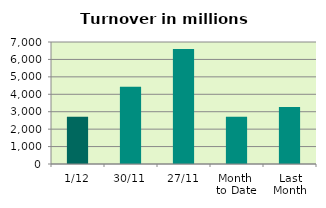
| Category | Series 0 |
|---|---|
| 1/12 | 2718.046 |
| 30/11 | 4426.2 |
| 27/11 | 6597.135 |
| Month 
to Date | 2718.046 |
| Last
Month | 3273.817 |